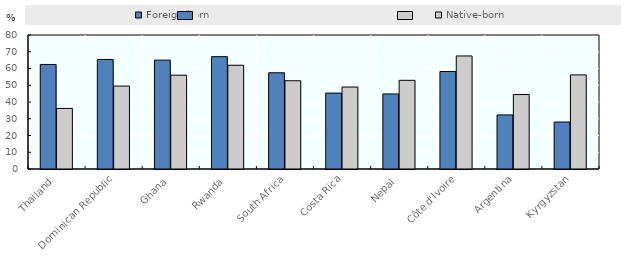
| Category | Foreign-born | Native-born |
|---|---|---|
| Thailand | 62.41 | 36.16 |
| Dominican Republic | 65.41 | 49.51 |
| Ghana | 65 | 56 |
| Rwanda | 67.08 | 61.93 |
| South Africa | 57.45 | 52.67 |
| Costa Rica | 45.32 | 48.93 |
| Nepal | 44.81 | 52.94 |
| Côte d'Ivoire | 58.2 | 67.5 |
| Argentina | 32.29 | 44.45 |
| Kyrgyzstan | 28.05 | 56.18 |